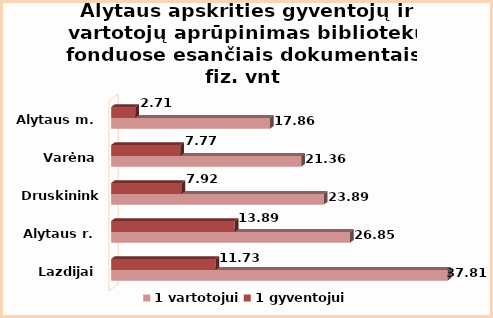
| Category | 1 vartotojui | 1 gyventojui |
|---|---|---|
| Lazdijai | 37.81 | 11.73 |
| Alytaus r. | 26.85 | 13.89 |
| Druskininkai | 23.89 | 7.92 |
| Varėna | 21.36 | 7.77 |
| Alytaus m. | 17.86 | 2.71 |